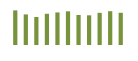
| Category | Saldo [ (1)-(2) ] |
|---|---|
| 0 | 329612.931 |
| 1 | 291358.085 |
| 2 | 266512.131 |
| 3 | 297562.723 |
| 4 | 310243.352 |
| 5 | 320678.349 |
| 6 | 286223.006 |
| 7 | 282809.198 |
| 8 | 306315.684 |
| 9 | 321868.253 |
| 10 | 306879.868 |